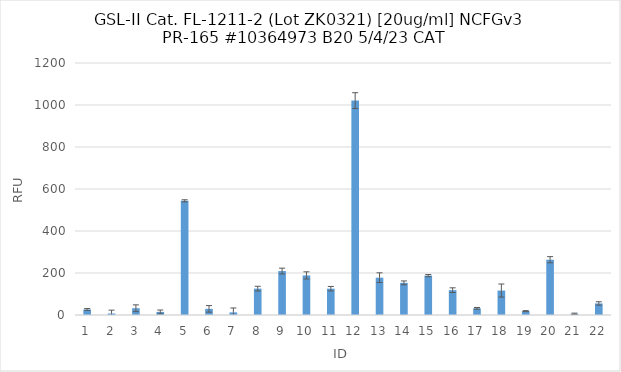
| Category | RFU |
|---|---|
| 0 | 26.25 |
| 1 | 7.25 |
| 2 | 32.25 |
| 3 | 14.75 |
| 4 | 543.75 |
| 5 | 29.25 |
| 6 | 12.5 |
| 7 | 125.5 |
| 8 | 209.25 |
| 9 | 188.5 |
| 10 | 125.25 |
| 11 | 1021 |
| 12 | 177.75 |
| 13 | 153 |
| 14 | 187.5 |
| 15 | 118.25 |
| 16 | 31.75 |
| 17 | 116.5 |
| 18 | 18.5 |
| 19 | 263.25 |
| 20 | 5.75 |
| 21 | 55 |